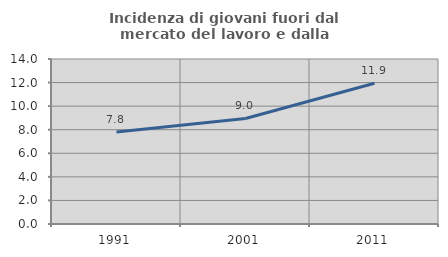
| Category | Incidenza di giovani fuori dal mercato del lavoro e dalla formazione  |
|---|---|
| 1991.0 | 7.812 |
| 2001.0 | 8.955 |
| 2011.0 | 11.94 |